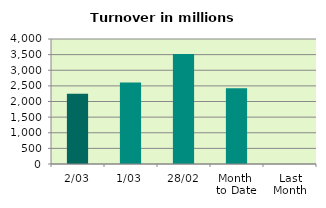
| Category | Series 0 |
|---|---|
| 2/03 | 2245.909 |
| 1/03 | 2606.75 |
| 28/02 | 3517.018 |
| Month 
to Date | 2426.329 |
| Last
Month | 0 |